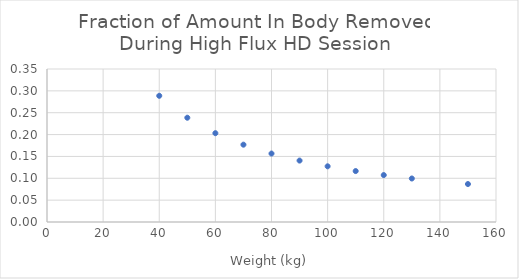
| Category | Series 0 |
|---|---|
| 40.0 | 0.289 |
| 50.0 | 0.239 |
| 60.0 | 0.203 |
| 70.0 | 0.177 |
| 80.0 | 0.157 |
| 90.0 | 0.14 |
| 100.0 | 0.127 |
| 110.0 | 0.117 |
| 120.0 | 0.107 |
| 130.0 | 0.1 |
| 150.0 | 0.087 |